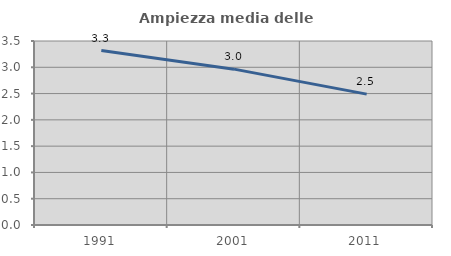
| Category | Ampiezza media delle famiglie |
|---|---|
| 1991.0 | 3.318 |
| 2001.0 | 2.965 |
| 2011.0 | 2.49 |